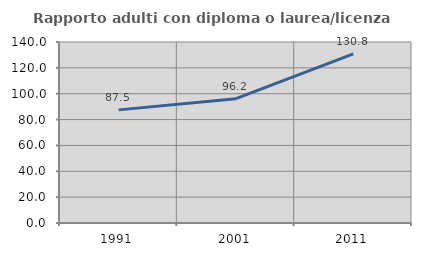
| Category | Rapporto adulti con diploma o laurea/licenza media  |
|---|---|
| 1991.0 | 87.5 |
| 2001.0 | 96.154 |
| 2011.0 | 130.769 |